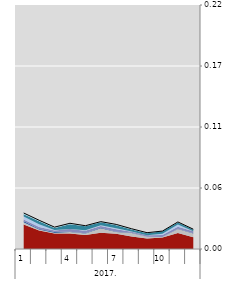
| Category | ПСС |
|---|---|
| 0 | 0.032 |
| 1 | 0.026 |
| 2 | 0.02 |
| 3 | 0.023 |
| 4 | 0.021 |
| 5 | 0.025 |
| 6 | 0.022 |
| 7 | 0.018 |
| 8 | 0.015 |
| 9 | 0.016 |
| 10 | 0.024 |
| 11 | 0.018 |